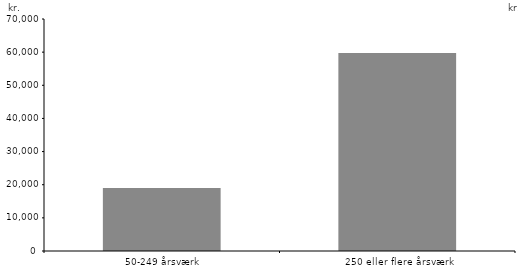
| Category | Series 0 |
|---|---|
| 50-249 årsværk | 18992 |
| 250 eller flere årsværk | 59756 |